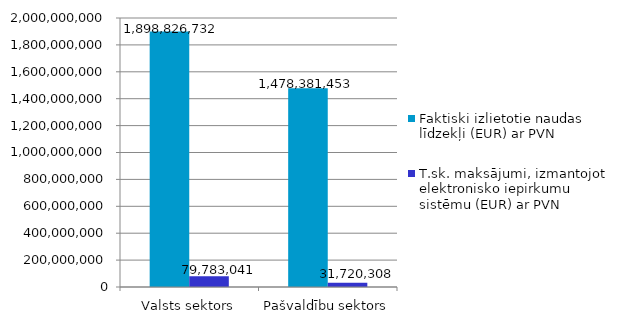
| Category | Faktiski izlietotie naudas līdzekļi (EUR) ar PVN | T.sk. maksājumi, izmantojot elektronisko iepirkumu sistēmu (EUR) ar PVN |
|---|---|---|
| Valsts sektors | 1898826732 | 79783041 |
| Pašvaldību sektors | 1478381453 | 31720308 |